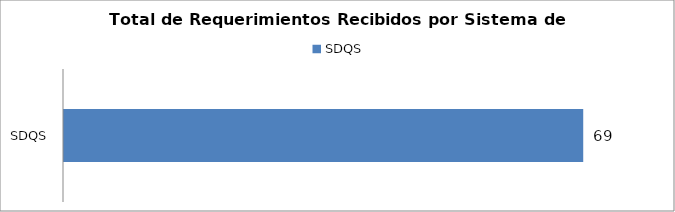
| Category | Total |
|---|---|
| SDQS | 69 |